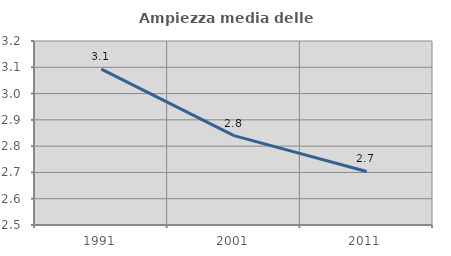
| Category | Ampiezza media delle famiglie |
|---|---|
| 1991.0 | 3.093 |
| 2001.0 | 2.84 |
| 2011.0 | 2.704 |